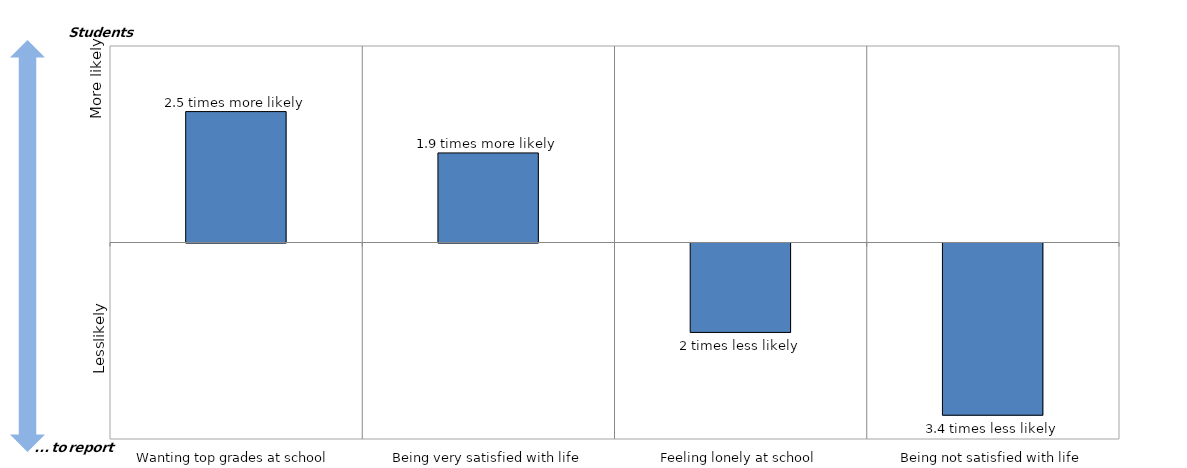
| Category | Series 0 |
|---|---|
| Wanting top grades at school | 0.4 |
| Being very satisfied with life | 0.273 |
| Feeling lonely at school | -0.273 |
| Being not satisfied with life | -0.526 |